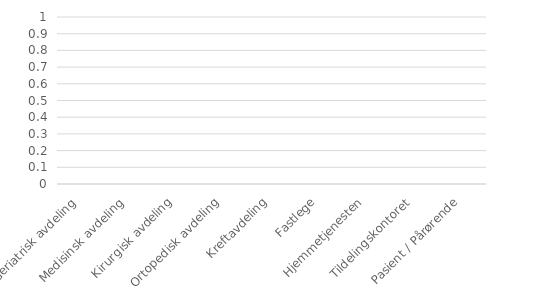
| Category | Series 0 |
|---|---|
| Geriatrisk avdeling | 0 |
| Medisinsk avdeling | 0 |
| Kirurgisk avdeling | 0 |
| Ortopedisk avdeling | 0 |
| Kreftavdeling | 0 |
| Fastlege | 0 |
| Hjemmetjenesten | 0 |
| Tildelingskontoret | 0 |
| Pasient / Pårørende | 0 |